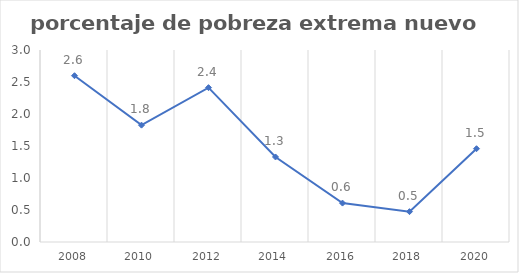
| Category | Series 0 |
|---|---|
| 2008.0 | 2.598 |
| 2010.0 | 1.826 |
| 2012.0 | 2.412 |
| 2014.0 | 1.328 |
| 2016.0 | 0.608 |
| 2018.0 | 0.474 |
| 2020.0 | 1.457 |